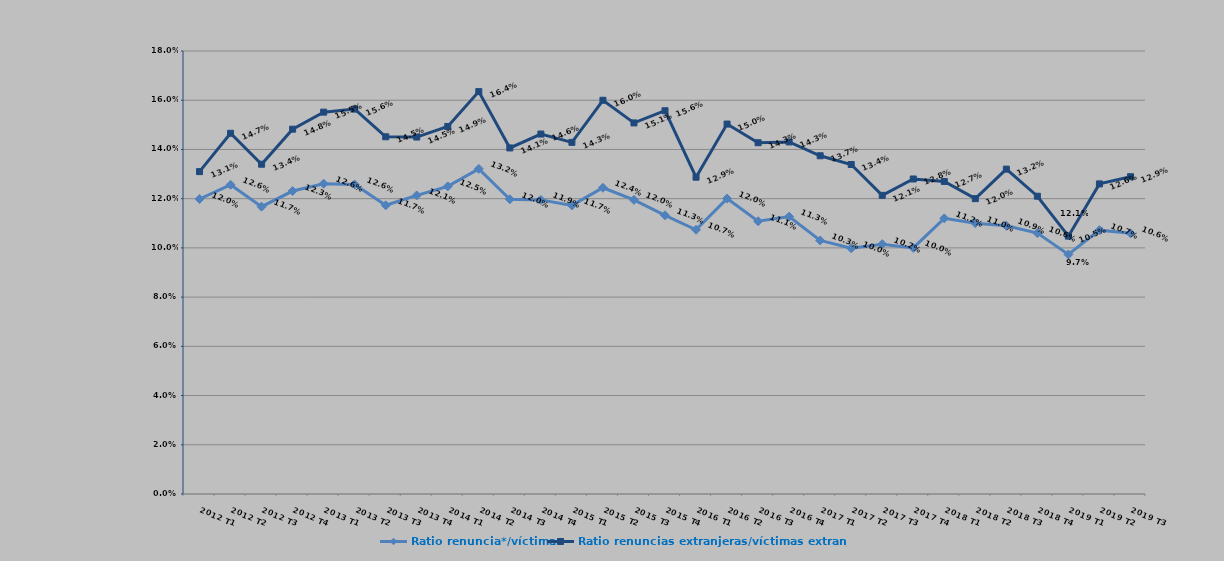
| Category | Ratio renuncia*/víctima | Ratio renuncias extranjeras/víctimas extranjeras |
|---|---|---|
| 2012 T1 | 0.12 | 0.131 |
| 2012 T2 | 0.126 | 0.147 |
| 2012 T3 | 0.117 | 0.134 |
| 2012 T4 | 0.123 | 0.148 |
| 2013 T1 | 0.126 | 0.155 |
| 2013 T2 | 0.126 | 0.156 |
| 2013 T3 | 0.117 | 0.145 |
| 2013 T4 | 0.121 | 0.145 |
| 2014 T1 | 0.125 | 0.149 |
| 2014 T2 | 0.132 | 0.164 |
| 2014 T3 | 0.12 | 0.141 |
| 2014 T4 | 0.119 | 0.146 |
| 2015 T1 | 0.117 | 0.143 |
| 2015 T2 | 0.124 | 0.16 |
| 2015 T3 | 0.12 | 0.151 |
| 2015 T4 | 0.113 | 0.156 |
| 2016 T1 | 0.107 | 0.129 |
| 2016 T2 | 0.12 | 0.15 |
| 2016 T3 | 0.111 | 0.143 |
| 2016 T4 | 0.113 | 0.143 |
| 2017 T1 | 0.103 | 0.137 |
| 2017 T2 | 0.1 | 0.134 |
| 2017 T3 | 0.102 | 0.121 |
| 2017 T4 | 0.1 | 0.128 |
| 2018 T1 | 0.112 | 0.127 |
| 2018 T2 | 0.11 | 0.12 |
| 2018 T3 | 0.109 | 0.132 |
| 2018 T4 | 0.106 | 0.121 |
| 2019 T1 | 0.097 | 0.105 |
| 2019 T2 | 0.107 | 0.126 |
| 2019 T3 | 0.106 | 0.129 |